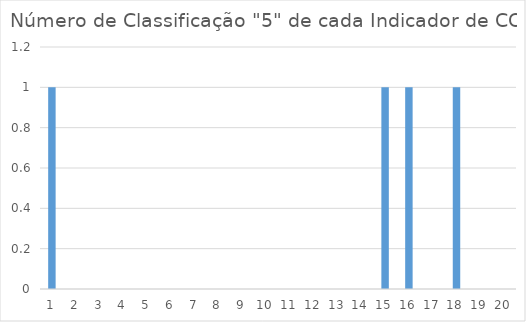
| Category | Series 0 |
|---|---|
| 0 | 1 |
| 1 | 0 |
| 2 | 0 |
| 3 | 0 |
| 4 | 0 |
| 5 | 0 |
| 6 | 0 |
| 7 | 0 |
| 8 | 0 |
| 9 | 0 |
| 10 | 0 |
| 11 | 0 |
| 12 | 0 |
| 13 | 0 |
| 14 | 1 |
| 15 | 1 |
| 16 | 0 |
| 17 | 1 |
| 18 | 0 |
| 19 | 0 |